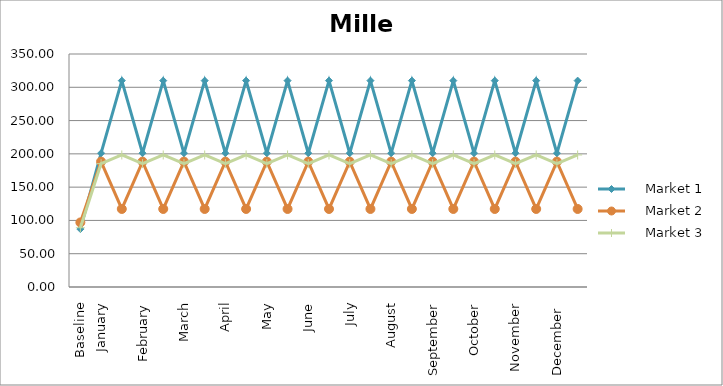
| Category |     Market 1 |     Market 2 |     Market 3 |
|---|---|---|---|
| Baseline | 87 | 97 | 89 |
| January | 201 | 188.333 | 185.333 |
|  | 310 | 117.222 | 198.333 |
| February | 201 | 188.333 | 185.333 |
|  | 310 | 117.222 | 198.333 |
| March | 201 | 188.333 | 185.333 |
|  | 310 | 117.222 | 198.333 |
| April | 201 | 188.333 | 185.333 |
|  | 310 | 117.222 | 198.333 |
| May | 201 | 188.333 | 185.333 |
|  | 310 | 117.222 | 198.333 |
| June | 201 | 188.333 | 185.333 |
|  | 310 | 117.222 | 198.333 |
| July | 201 | 188.333 | 185.333 |
|  | 310 | 117.222 | 198.333 |
| August | 201 | 188.333 | 185.333 |
|  | 310 | 117.222 | 198.333 |
| September | 201 | 188.333 | 185.333 |
|  | 310 | 117.222 | 198.333 |
| October | 201 | 188.333 | 185.333 |
|  | 310 | 117.222 | 198.333 |
| November | 201 | 188.333 | 185.333 |
|  | 310 | 117.222 | 198.333 |
| December  | 201 | 188.333 | 185.333 |